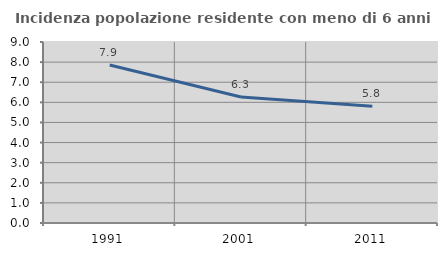
| Category | Incidenza popolazione residente con meno di 6 anni |
|---|---|
| 1991.0 | 7.859 |
| 2001.0 | 6.264 |
| 2011.0 | 5.805 |